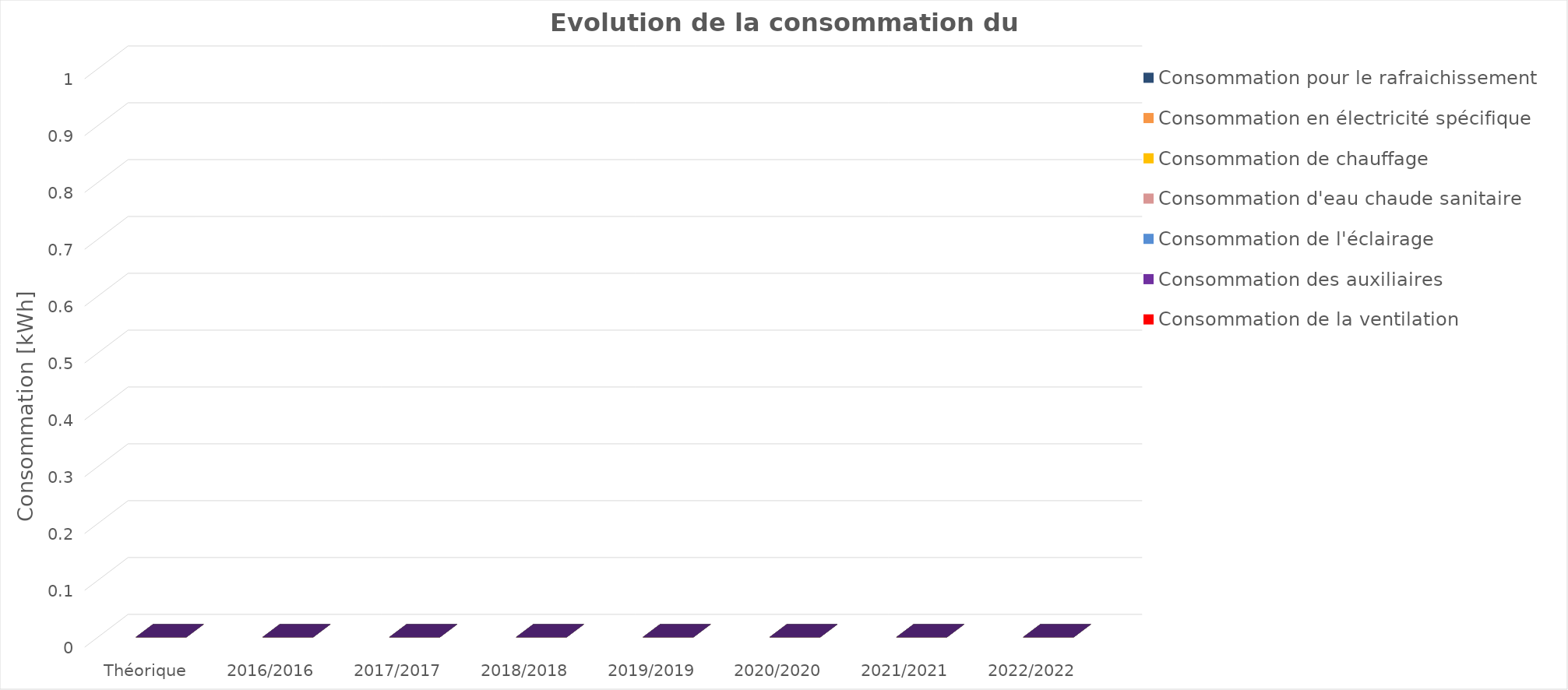
| Category | Consommation de la ventilation | Consommation des auxiliaires  | Consommation de l'éclairage | Consommation d'eau chaude sanitaire | Consommation de chauffage | Consommation en électricité spécifique | Consommation pour le rafraichissement |
|---|---|---|---|---|---|---|---|
| Théorique | 0 | 0 | 0 | 0 | 0 | 0 | 0 |
| 2016/2016 | 0 | 0 | 0 | 0 | 0 | 0 | 0 |
| 2017/2017 | 0 | 0 | 0 | 0 | 0 | 0 | 0 |
| 2018/2018 | 0 | 0 | 0 | 0 | 0 | 0 | 0 |
| 2019/2019 | 0 | 0 | 0 | 0 | 0 | 0 | 0 |
| 2020/2020 | 0 | 0 | 0 | 0 | 0 | 0 | 0 |
| 2021/2021 | 0 | 0 | 0 | 0 | 0 | 0 | 0 |
| 2022/2022 | 0 | 0 | 0 | 0 | 0 | 0 | 0 |